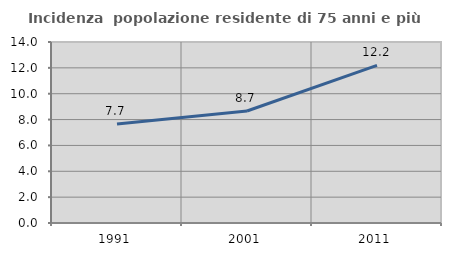
| Category | Incidenza  popolazione residente di 75 anni e più |
|---|---|
| 1991.0 | 7.656 |
| 2001.0 | 8.664 |
| 2011.0 | 12.194 |